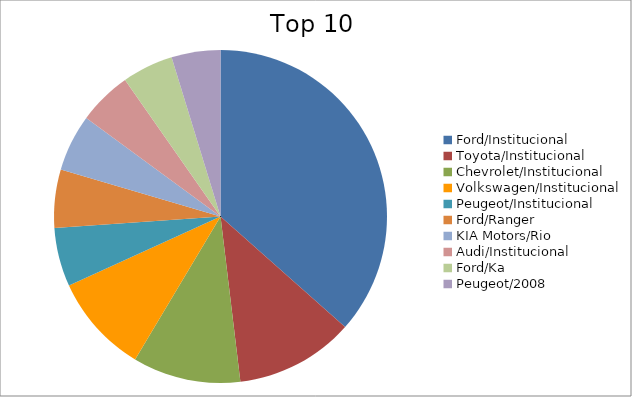
| Category | Series 0 |
|---|---|
| Ford/Institucional | 24.34 |
| Toyota/Institucional | 7.69 |
| Chevrolet/Institucional | 6.98 |
| Volkswagen/Institucional | 6.41 |
| Peugeot/Institucional | 3.8 |
| Ford/Ranger | 3.77 |
| KIA Motors/Rio | 3.67 |
| Audi/Institucional | 3.47 |
| Ford/Ka | 3.31 |
| Peugeot/2008 | 3.16 |